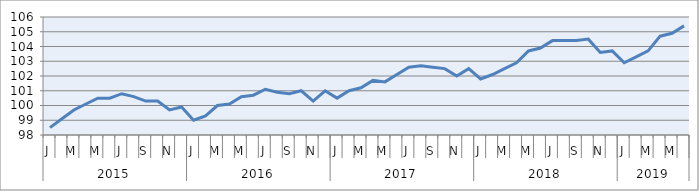
| Category | Series 0 |
|---|---|
| 0 | 98.5 |
| 1900-01-01 | 99.1 |
| 1900-01-02 | 99.7 |
| 1900-01-03 | 100.1 |
| 1900-01-04 | 100.5 |
| 1900-01-05 | 100.5 |
| 1900-01-06 | 100.8 |
| 1900-01-07 | 100.6 |
| 1900-01-08 | 100.3 |
| 1900-01-09 | 100.3 |
| 1900-01-10 | 99.7 |
| 1900-01-11 | 99.9 |
| 1900-01-12 | 99 |
| 1900-01-13 | 99.3 |
| 1900-01-14 | 100 |
| 1900-01-15 | 100.1 |
| 1900-01-16 | 100.6 |
| 1900-01-17 | 100.7 |
| 1900-01-18 | 101.1 |
| 1900-01-19 | 100.9 |
| 1900-01-20 | 100.8 |
| 1900-01-21 | 101 |
| 1900-01-22 | 100.3 |
| 1900-01-23 | 101 |
| 1900-01-24 | 100.5 |
| 1900-01-25 | 101 |
| 1900-01-26 | 101.2 |
| 1900-01-27 | 101.7 |
| 1900-01-28 | 101.6 |
| 1900-01-29 | 102.1 |
| 1900-01-30 | 102.6 |
| 1900-01-31 | 102.7 |
| 1900-02-01 | 102.6 |
| 1900-02-02 | 102.5 |
| 1900-02-03 | 102 |
| 1900-02-04 | 102.5 |
| 1900-02-05 | 101.8 |
| 1900-02-06 | 102.1 |
| 1900-02-07 | 102.5 |
| 1900-02-08 | 102.9 |
| 1900-02-09 | 103.7 |
| 1900-02-10 | 103.9 |
| 1900-02-11 | 104.4 |
| 1900-02-12 | 104.4 |
| 1900-02-13 | 104.4 |
| 1900-02-14 | 104.5 |
| 1900-02-15 | 103.6 |
| 1900-02-16 | 103.7 |
| 1900-02-17 | 102.9 |
| 1900-02-18 | 103.3 |
| 1900-02-19 | 103.7 |
| 1900-02-20 | 104.7 |
| 1900-02-21 | 104.9 |
| 1900-02-22 | 105.4 |